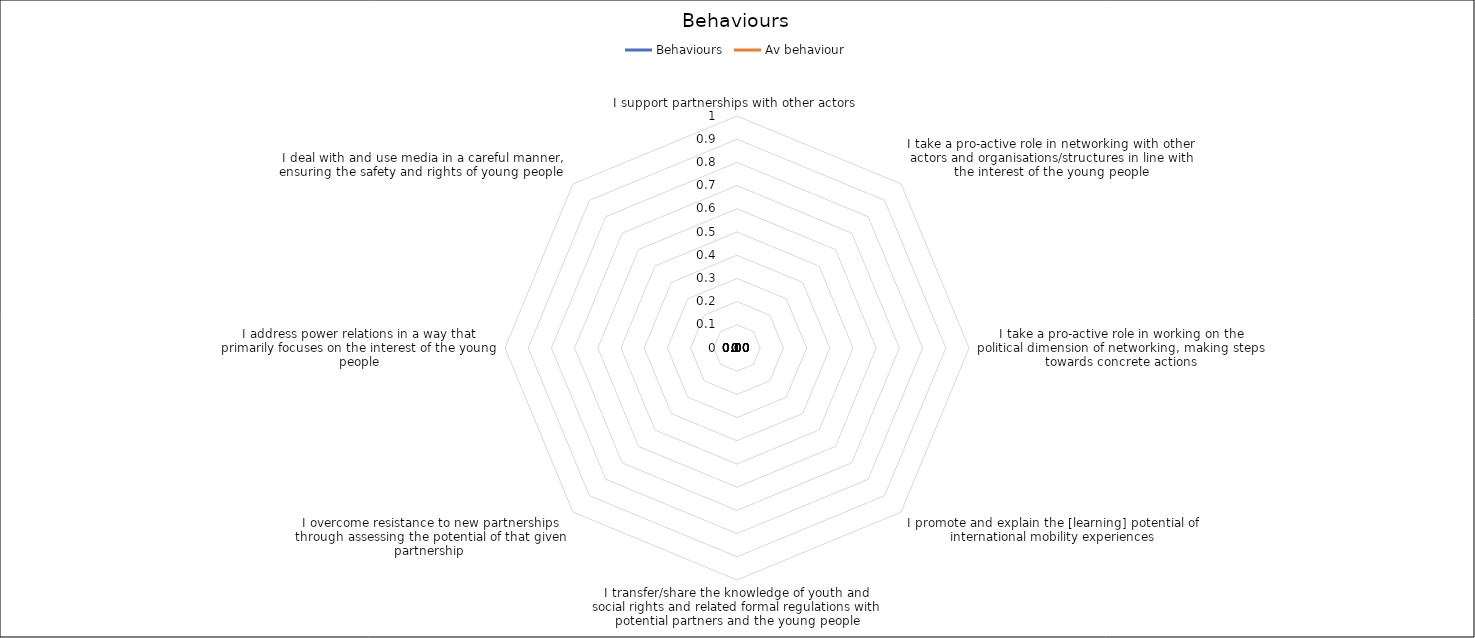
| Category | Behaviours | Av behaviour |
|---|---|---|
| I support partnerships with other actors  | 0 | 0 |
| I take a pro-active role in networking with other actors and organisations/structures in line with the interest of the young people | 0 | 0 |
| I take a pro-active role in working on the political dimension of networking, making steps towards concrete actions | 0 | 0 |
| I promote and explain the [learning] potential of international mobility experiences | 0 | 0 |
| I transfer/share the knowledge of youth and social rights and related formal regulations with potential partners and the young people | 0 | 0 |
| I overcome resistance to new partnerships through assessing the potential of that given partnership  | 0 | 0 |
| I address power relations in a way that primarily focuses on the interest of the young people | 0 | 0 |
| I deal with and use media in a careful manner, ensuring the safety and rights of young people  | 0 | 0 |